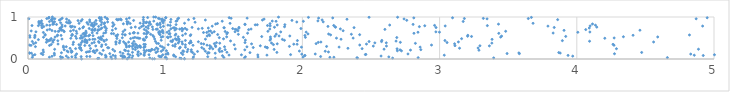
| Category | Series 0 |
|---|---|
| 0.3904208586501806 | 0.001 |
| 0.7224634683176403 | 0.002 |
| 93.24804790479168 | 0.003 |
| 1.0115581010432688 | 0.004 |
| 0.9070929696387279 | 0.005 |
| 0.9216799077854235 | 0.006 |
| 1.140309312723441 | 0.007 |
| 1.1406310190435358 | 0.008 |
| 0.6110892613390222 | 0.009 |
| 1.1173778949842978 | 0.01 |
| 9.550406828601867 | 0.011 |
| 0.507862508019153 | 0.012 |
| 10.350093718853833 | 0.013 |
| 0.24001847650218214 | 0.014 |
| 1.202125646748657 | 0.015 |
| 0.516437934840919 | 0.016 |
| 0.7275032811052431 | 0.017 |
| 0.6375950462996232 | 0.018 |
| 1.3656422560152768 | 0.019 |
| 1.1071588054082322 | 0.02 |
| 2.657551177952785 | 0.021 |
| 0.6905029887055065 | 0.022 |
| 0.7584504981340087 | 0.023 |
| 2.401090544615953 | 0.024 |
| 0.887607833776923 | 0.025 |
| 3.394194840833525 | 0.026 |
| 1.5779725088348266 | 0.027 |
| 2.3970208504834254 | 0.028 |
| 0.2935454160996004 | 0.029 |
| 6.54520538152202 | 0.03 |
| 2.8437195868729748 | 0.031 |
| 0.3474065861599035 | 0.032 |
| 4.660196273899444 | 0.033 |
| 1.0057952650747886 | 0.034 |
| 0.2521016348054121 | 0.035 |
| 1.4274591455377272 | 0.036 |
| 0.9996432079953819 | 0.037 |
| 0.03146978091118718 | 0.038 |
| 0.5669706977537479 | 0.039 |
| 2.200258844787325 | 0.04 |
| 0.7048157800695156 | 0.041 |
| 2.229505819442826 | 0.042 |
| 0.1559593540440948 | 0.043 |
| 0.73794206559285 | 0.044 |
| 2.0041774318019425 | 0.045 |
| 0.9693731355182663 | 0.046 |
| 1.6764291403293654 | 0.047 |
| 5.913428078234331 | 0.048 |
| 1.2061717591329149 | 0.049 |
| 2.629944489494246 | 0.05 |
| 0.6034730459098727 | 0.051 |
| 0.3196902168349919 | 0.052 |
| 1.5845676873782488 | 0.053 |
| 1.075687558202282 | 0.054 |
| 1.3101412361241942 | 0.055 |
| 0.23703898886081393 | 0.056 |
| 0.3873204045824351 | 0.057 |
| 0.9602662011952376 | 0.058 |
| 2.1329251492537775 | 0.059 |
| 0.45147952914074063 | 0.06 |
| 0.42835409408361447 | 0.061 |
| 0.7021967670487395 | 0.062 |
| 0.5693050346113226 | 0.063 |
| 0.17476697649603926 | 0.064 |
| 0.9717330086798003 | 0.065 |
| 56.40532943330702 | 0.066 |
| 0.6901861116166296 | 0.067 |
| 3.9702295942843358 | 0.068 |
| 0.27985299569156796 | 0.069 |
| 0.9535558575155026 | 0.07 |
| 2.5734029708976323 | 0.071 |
| 24.902312995444657 | 0.072 |
| 0.636637335461173 | 0.073 |
| 5.213605927915726 | 0.074 |
| 0.7628516542126448 | 0.075 |
| 15.06368990211785 | 0.076 |
| 1.0619913193970412 | 0.077 |
| 0.6780418851739588 | 0.078 |
| 1.4175017104825045 | 0.079 |
| 2.016623004243082 | 0.08 |
| 0.8043165984891493 | 0.081 |
| 0.34538997242948954 | 0.082 |
| 4.92156401695732 | 0.083 |
| 2.0186783364706637 | 0.084 |
| 0.0362806825921593 | 0.085 |
| 3.9362806010655884 | 0.086 |
| 0.8470096098435042 | 0.087 |
| 0.6198396741018343 | 0.088 |
| 0.5645281775505114 | 0.089 |
| 4.856336911274629 | 0.09 |
| 3.034061658264664 | 0.091 |
| 1.7415778233696646 | 0.092 |
| 11.74069348133084 | 0.093 |
| 1.4652456185568807 | 0.094 |
| 0.19261243383300874 | 0.095 |
| 1.0619821446761968 | 0.096 |
| 1.6750869750640809 | 0.097 |
| 0.741900072375269 | 0.098 |
| 1.5556235815098671 | 0.099 |
| 0.9826933407859471 | 0.1 |
| 5.0032971514174776 | 0.101 |
| 0.8823689682634753 | 0.102 |
| 0.05033637797966757 | 0.103 |
| 1.913903141764744 | 0.104 |
| 0.10856611668738951 | 0.105 |
| 2.458949905042348 | 0.106 |
| 0.8463501018340568 | 0.107 |
| 5.945781745367078 | 0.108 |
| 1.1283838234190875 | 0.109 |
| 2.4627177933071036 | 0.11 |
| 0.536779817446193 | 0.111 |
| 0.7989448526892731 | 0.112 |
| 1.212809771813365 | 0.113 |
| 1.005748639909137 | 0.114 |
| 1.9953955701724966 | 0.115 |
| 0.729148160365058 | 0.116 |
| 4.830407907290476 | 0.117 |
| 1.021093727402213 | 0.118 |
| 2.093510772456517 | 0.119 |
| 2.7695282704059436 | 0.12 |
| 0.3542711326076258 | 0.121 |
| 0.8210768299715608 | 0.122 |
| 17.97601704199181 | 0.123 |
| 158.7590128667085 | 0.124 |
| 4.274740190742463 | 0.125 |
| 5.912430309858572 | 0.126 |
| 3.581582078901271 | 0.127 |
| 0.5959013044789266 | 0.128 |
| 0.09705163452122967 | 0.129 |
| 3.491926829170612 | 0.13 |
| 23.156264711911263 | 0.131 |
| 7.968953658375679 | 0.132 |
| 0.6917674384013444 | 0.133 |
| 1.3085797286923673 | 0.134 |
| 5.324989735651629 | 0.135 |
| 0.1919611470316079 | 0.136 |
| 0.025143612356156034 | 0.137 |
| 1.364637392657013 | 0.138 |
| 0.01197382808617128 | 0.139 |
| 0.5231391948127904 | 0.14 |
| 3.8789555203863126 | 0.141 |
| 1.0182714674002338 | 0.142 |
| 0.010638228529836763 | 0.143 |
| 1.1181338290595644 | 0.144 |
| 3.5779136777138745 | 0.145 |
| 12.118537452557282 | 0.146 |
| 1.319633804926313 | 0.147 |
| 0.2434603915180901 | 0.148 |
| 0.8496520167695997 | 0.149 |
| 0.48779918920067505 | 0.15 |
| 1.3127603893806319 | 0.151 |
| 1.6177533933054504 | 0.152 |
| 3.8687753673519003 | 0.153 |
| 1.1997959088008232 | 0.154 |
| 0.9329654674737099 | 0.155 |
| 4.472819152503994 | 0.156 |
| 1.814087955553271 | 0.157 |
| 0.7614984726515731 | 0.158 |
| 0.3165766565693606 | 0.159 |
| 1.4500134866399834 | 0.16 |
| 0.42524663592827866 | 0.161 |
| 0.6720742327133846 | 0.162 |
| 7.023590245757066 | 0.163 |
| 5.859085602453996 | 0.164 |
| 0.11249944870154838 | 0.165 |
| 0.8523924857561492 | 0.166 |
| 0.8018323006045415 | 0.167 |
| 2.1897798361963168 | 0.168 |
| 0.29222430999851506 | 0.169 |
| 0.4819432856519468 | 0.17 |
| 0.8040731521794381 | 0.171 |
| 0.4376037572626588 | 0.172 |
| 5.52774229598955 | 0.173 |
| 1.1600246813176922 | 0.174 |
| 0.32118382544690827 | 0.175 |
| 1.3974455405173736 | 0.176 |
| 1.1904910924124774 | 0.177 |
| 1.134271802338638 | 0.178 |
| 0.44955240467382923 | 0.179 |
| 1.2358798282290104 | 0.18 |
| 0.9447957674853399 | 0.181 |
| 0.4738977761460838 | 0.182 |
| 1.4137301253187264 | 0.183 |
| 0.971265073639037 | 0.184 |
| 2.16631409319161 | 0.185 |
| 1.2926219802228434 | 0.186 |
| 0.7311537584401281 | 0.187 |
| 0.6318015515967654 | 0.188 |
| 1.978031969538785 | 0.189 |
| 0.8921212343450291 | 0.19 |
| 0.28492352538025917 | 0.191 |
| 8.03472377380157 | 0.192 |
| 117.96141894439498 | 0.193 |
| 2.7220411136727565 | 0.194 |
| 1.130028786211404 | 0.195 |
| 2.69222020570313 | 0.196 |
| 1.0088805800135765 | 0.197 |
| 0.4790731452161299 | 0.198 |
| 0.3155721265950204 | 0.199 |
| 0.7117137818727228 | 0.2 |
| 0.8834366943745738 | 0.201 |
| 0.8795194671797385 | 0.202 |
| 0.8646546344104761 | 0.203 |
| 5.321586537450074 | 0.204 |
| 0.4995399434966901 | 0.205 |
| 0.5480714485456839 | 0.206 |
| 0.846292543994284 | 0.207 |
| 0.38963819358408885 | 0.208 |
| 3.286884652759784 | 0.209 |
| 0.5031527630298526 | 0.21 |
| 79.73821878344116 | 0.211 |
| 2.787827099544835 | 0.212 |
| 0.7043659235199754 | 0.213 |
| 0.11048746995592763 | 0.214 |
| 0.9836523539448905 | 0.215 |
| 1.3918197187474795 | 0.216 |
| 1.5802657551381485 | 0.217 |
| 2.7117195548751556 | 0.218 |
| 1.1905959896139902 | 0.219 |
| 0.9221680847900617 | 0.22 |
| 0.26384874631213656 | 0.221 |
| 2.8632048914007164 | 0.222 |
| 1.4369054737756923 | 0.223 |
| 0.9035731197171718 | 0.224 |
| 0.7823927675280756 | 0.225 |
| 0.6181798721518252 | 0.226 |
| 1.1654880344272986 | 0.227 |
| 1.793939052606178 | 0.228 |
| 0.9014976633190611 | 0.229 |
| 6.047846491273578 | 0.23 |
| 0.19421974173355375 | 0.231 |
| 23.277162177307627 | 0.232 |
| 4.886752051951847 | 0.233 |
| 2.5951405063250155 | 0.234 |
| 19.170734804408024 | 0.235 |
| 25.277890034087584 | 0.236 |
| 8.41282374842962 | 0.237 |
| 1.2813851694060185 | 0.238 |
| 1.510515908911397 | 0.239 |
| 0.7641239980142636 | 0.24 |
| 0.9469437901512678 | 0.241 |
| 1.3469380910977513 | 0.242 |
| 2.6900101909553245 | 0.243 |
| 24.942244019144493 | 0.244 |
| 4.288977885256083 | 0.245 |
| 2.435209371449018 | 0.246 |
| 0.3470431873699796 | 0.247 |
| 7.355784567148473 | 0.248 |
| 1.3243503714505216 | 0.249 |
| 0.3778550004000554 | 0.25 |
| 1.3983599060514624 | 0.251 |
| 0.4554508042119398 | 0.252 |
| 8.024750004593155 | 0.253 |
| 0.30644777368299403 | 0.254 |
| 2.3319127307787237 | 0.255 |
| 1.1041253409286558 | 0.256 |
| 3.1454974894645527 | 0.257 |
| 14.6812923480931 | 0.258 |
| 0.38344208950222985 | 0.259 |
| 5.241976877969311 | 0.26 |
| 9.764916453418863 | 0.261 |
| 3.2806386266519714 | 0.262 |
| 0.9921925398643346 | 0.263 |
| 0.9355945908941822 | 0.264 |
| 1.744329357301709 | 0.265 |
| 15.801703717176938 | 0.266 |
| 0.5881181354861371 | 0.267 |
| 0.7975278827252588 | 0.268 |
| 0.3823315296322677 | 0.269 |
| 0.5803106599537039 | 0.27 |
| 1.266500687621383 | 0.271 |
| 0.3756621980712856 | 0.272 |
| 1.64161984780203 | 0.273 |
| 0.8439505078716326 | 0.274 |
| 0.25848305001874755 | 0.275 |
| 0.8198551878300591 | 0.276 |
| 7.735245040437717 | 0.277 |
| 1.7422060828999955 | 0.278 |
| 1.1097293144348754 | 0.279 |
| 0.781657130806268 | 0.28 |
| 1.1474498165344857 | 0.281 |
| 1.9931385735935652 | 0.282 |
| 2.858165330383202 | 0.283 |
| 2.267476089645902 | 0.284 |
| 1.3347944969167351 | 0.285 |
| 0.7178546332825597 | 0.286 |
| 1.7296599392468217 | 0.287 |
| 0.9790882009847365 | 0.288 |
| 0.8528109273962623 | 0.289 |
| 1.5956466996195382 | 0.29 |
| 1.4324795348564159 | 0.291 |
| 0.27891887790711245 | 0.292 |
| 0.8488847681106056 | 0.293 |
| 0.05426887653352738 | 0.294 |
| 1.3678082073680136 | 0.295 |
| 0.737411304130869 | 0.296 |
| 0.7589263679845272 | 0.297 |
| 0.5352886536274918 | 0.298 |
| 2.176270093264477 | 0.299 |
| 1.9052629820552063 | 0.3 |
| 1.071361686140702 | 0.301 |
| 58.21699415183581 | 0.302 |
| 0.8190259761217356 | 0.303 |
| 0.8124092553414924 | 0.304 |
| 0.25809805886529313 | 0.305 |
| 31.448216722459293 | 0.306 |
| 2.5167705738864847 | 0.307 |
| 2.612545223973778 | 0.308 |
| 0.9650133964150819 | 0.309 |
| 0.7392258499579542 | 0.31 |
| 0.49388621267291066 | 0.311 |
| 3.3628493724110458 | 0.312 |
| 0.8141473438941318 | 0.313 |
| 1.6932961368511223 | 0.314 |
| 3.2940278840485244 | 0.315 |
| 1.3666161976212794 | 0.316 |
| 3.112141792572463 | 0.317 |
| 1.3248718606952778 | 0.318 |
| 1.0559086602199563 | 0.319 |
| 0.44803328018792715 | 0.32 |
| 0.793693028592533 | 0.321 |
| 0.4140926467568455 | 0.322 |
| 0.1568560706517375 | 0.323 |
| 0.021667784241185074 | 0.324 |
| 5.65688191719371 | 0.325 |
| 1.202817243424866 | 0.326 |
| 4.271144927182041 | 0.327 |
| 0.7684586897208964 | 0.328 |
| 0.7161234195522486 | 0.329 |
| 1.304858307674221 | 0.33 |
| 0.011200334743358284 | 0.331 |
| 2.941055127369758 | 0.332 |
| 2.4180382251008137 | 0.333 |
| 7.389168097169208 | 0.334 |
| 8.782734696534185 | 0.335 |
| 0.5383787424957595 | 0.336 |
| 0.3828867252114427 | 0.337 |
| 1.5029693317823798 | 0.338 |
| 1.147139161308411 | 0.339 |
| 1.0217572150020646 | 0.34 |
| 26.637621752016454 | 0.341 |
| 0.37132071262303584 | 0.342 |
| 1.7888178692920575 | 0.343 |
| 0.5675744616093484 | 0.344 |
| 0.16915017847176536 | 0.345 |
| 0.8555383870601507 | 0.346 |
| 0.32823431526187147 | 0.347 |
| 5.3008725324470785 | 0.348 |
| 0.844542605896369 | 0.349 |
| 4.264071060744708 | 0.35 |
| 1.9614668201970984 | 0.351 |
| 1.0746633946236614 | 0.352 |
| 1.9370705574869416 | 0.353 |
| 0.6411286310465669 | 0.354 |
| 2.4669628815766083 | 0.355 |
| 0.21896560519905092 | 0.356 |
| 0.7828909964774883 | 0.357 |
| 1.2804179768354724 | 0.358 |
| 1.1257984665232028 | 0.359 |
| 1.6294331305511143 | 0.36 |
| 1.8165185662102985 | 0.361 |
| 3.1094192211225464 | 0.362 |
| 0.7135026869649641 | 0.363 |
| 0.04069675924937377 | 0.364 |
| 1.3581173492064302 | 0.365 |
| 2.0999471747960095 | 0.366 |
| 1.262586170554558 | 0.367 |
| 0.9507399265441291 | 0.368 |
| 6.367951670640007 | 0.369 |
| 0.7614148194771593 | 0.37 |
| 0.7080286173931498 | 0.371 |
| 6.805960710954278 | 0.372 |
| 2.823622429249192 | 0.373 |
| 0.9379006862825919 | 0.374 |
| 6.769969397307347 | 0.375 |
| 0.46606503327524906 | 0.376 |
| 1.3975804267537821 | 0.377 |
| 3.3809670414581094 | 0.378 |
| 1.1771537448248792 | 0.379 |
| 1.7749252857895015 | 0.38 |
| 1.1789684430766096 | 0.381 |
| 1.0954842723782914 | 0.382 |
| 0.6666815312890992 | 0.383 |
| 2.5281008697332554 | 0.384 |
| 2.6114349741576786 | 0.385 |
| 9.950072016151392 | 0.386 |
| 0.05619769856632537 | 0.387 |
| 0.4294095921813461 | 0.388 |
| 1.3735627660368062 | 0.389 |
| 0.3889910412966396 | 0.39 |
| 1.5817452535383172 | 0.391 |
| 3.054370265272698 | 0.392 |
| 0.5187153518624924 | 0.393 |
| 1.1892641643772104 | 0.394 |
| 0.48271697695913324 | 0.395 |
| 2.1157017495997854 | 0.396 |
| 2.7139338688091463 | 0.397 |
| 0.13396020345995077 | 0.398 |
| 0.1814616534107095 | 0.399 |
| 0.33130002297210914 | 0.4 |
| 0.6408810071944332 | 0.401 |
| 0.7333349617704902 | 0.402 |
| 0.4181856590861211 | 0.403 |
| 2.1349069343515126 | 0.404 |
| 4.559809181897219 | 0.405 |
| 3.137043105622319 | 0.406 |
| 0.4124993860407378 | 0.407 |
| 1.1227438056980559 | 0.408 |
| 0.641122539675348 | 0.409 |
| 0.6969200517213295 | 0.41 |
| 1.2417511584264074 | 0.411 |
| 6.262392033236318 | 0.412 |
| 1.051038641856876 | 0.413 |
| 2.576656647310373 | 0.414 |
| 0.5141192893243821 | 0.415 |
| 2.4861829075815076 | 0.416 |
| 0.03146321880194156 | 0.417 |
| 0.7720410800046276 | 0.418 |
| 0.9288959199092058 | 0.419 |
| 1.1017804738062131 | 0.42 |
| 21.034438249662692 | 0.421 |
| 0.5555179773554528 | 0.422 |
| 4.093135679291383 | 0.423 |
| 0.428693383228482 | 0.424 |
| 1.0411705567535947 | 0.425 |
| 2.682665428400688 | 0.426 |
| 1.1857168087870182 | 0.427 |
| 11.093064698798587 | 0.428 |
| 0.3966056542464333 | 0.429 |
| 1.4763385132316118 | 0.43 |
| 0.18017049488987097 | 0.431 |
| 0.1500572731455885 | 0.432 |
| 0.6694599687070822 | 0.433 |
| 0.21747738940950445 | 0.434 |
| 19.735894233891603 | 0.435 |
| 0.4306758068743165 | 0.436 |
| 3.8948436372382074 | 0.437 |
| 0.14340086661366652 | 0.438 |
| 1.9635532698305795 | 0.439 |
| 3.0389454064260435 | 0.44 |
| 1.1471496341994645 | 0.441 |
| 0.5520845891743339 | 0.442 |
| 2.579019303413462 | 0.443 |
| 5.716257014218051 | 0.444 |
| 1.8691235557517665 | 0.445 |
| 0.9708793183225154 | 0.446 |
| 1.7637536535128082 | 0.447 |
| 0.8502823246144781 | 0.448 |
| 0.16218598872092177 | 0.449 |
| 1.5844644654871218 | 0.45 |
| 0.15793613932950856 | 0.451 |
| 1.0557551022268263 | 0.452 |
| 5.293856799928572 | 0.453 |
| 0.8424322247942896 | 0.454 |
| 0.41855751092524496 | 0.455 |
| 0.5720801074917394 | 0.456 |
| 1.0840229069558325 | 0.457 |
| 0.1897687842028945 | 0.458 |
| 10.653794305220957 | 0.459 |
| 0.41618772630650974 | 0.46 |
| 0.07584135809394718 | 0.461 |
| 0.13562664237075991 | 0.462 |
| 0.44865261951185365 | 0.463 |
| 0.5342527095661235 | 0.464 |
| 1.1016926527154316 | 0.465 |
| 1.0819251183529424 | 0.466 |
| 1.8542778152276798 | 0.467 |
| 3.382403449417808 | 0.468 |
| 0.48734814495501083 | 0.469 |
| 0.47273842640076386 | 0.47 |
| 2.2815518987534853 | 0.471 |
| 1.2932584743116102 | 0.472 |
| 13.938231792238213 | 0.473 |
| 0.8417622377425202 | 0.474 |
| 0.2477292188242144 | 0.475 |
| 0.9230808357580139 | 0.476 |
| 9.310833234141361 | 0.477 |
| 1.7686426520817538 | 0.478 |
| 5.776873031833621 | 0.479 |
| 1.4251229310205578 | 0.48 |
| 0.5252282885662322 | 0.481 |
| 1.0978005429573467 | 0.482 |
| 1.073571669352955 | 0.483 |
| 3.1603683917097745 | 0.484 |
| 0.5353080606821404 | 0.485 |
| 0.7480526482233805 | 0.486 |
| 0.16909036491608972 | 0.487 |
| 0.6479701050859636 | 0.488 |
| 6.121611183742235 | 0.489 |
| 9.59061035482723 | 0.49 |
| 0.3531861213231779 | 0.491 |
| 0.8153262110036582 | 0.492 |
| 0.3121419127985828 | 0.493 |
| 4.204225142029085 | 0.494 |
| 0.3803105137877545 | 0.495 |
| 0.8048035969210765 | 0.496 |
| 2.248398952043917 | 0.497 |
| 2.3699087667680745 | 0.498 |
| 0.3913678725219491 | 0.499 |
| 12.89361255985204 | 0.5 |
| 4.272302785188142 | 0.501 |
| 0.7660944696891553 | 0.502 |
| 6.87664539235033 | 0.503 |
| 0.7948689469002811 | 0.504 |
| 0.6875089786678268 | 0.505 |
| 0.5136376542440113 | 0.506 |
| 1.021677011976477 | 0.507 |
| 1.3942765584423715 | 0.508 |
| 0.3979397671254565 | 0.509 |
| 0.04871121249158478 | 0.51 |
| 2.6880501011494107 | 0.511 |
| 6.323269155851756 | 0.512 |
| 0.861049278189524 | 0.513 |
| 0.779125453457478 | 0.514 |
| 2.021960303166296 | 0.515 |
| 1.5698477296740994 | 0.516 |
| 0.014002758030806155 | 0.517 |
| 0.11302047677649103 | 0.518 |
| 0.9708336569971437 | 0.519 |
| 0.5291953637817998 | 0.52 |
| 1.0163143855008285 | 0.521 |
| 3.4449906410928333 | 0.522 |
| 0.19738347091202565 | 0.523 |
| 1.766783949189999 | 0.524 |
| 4.589734910363589 | 0.525 |
| 0.9171983754308478 | 0.526 |
| 1.4481159805186752 | 0.527 |
| 0.862900761577306 | 0.528 |
| 1.0947204718675219 | 0.529 |
| 4.339636828232408 | 0.53 |
| 1.0387327979210894 | 0.531 |
| 17.155339138235135 | 0.532 |
| 0.9827301171949628 | 0.533 |
| 1.7035140276119467 | 0.534 |
| 0.6471458408211673 | 0.535 |
| 6.437053850442917 | 0.536 |
| 3.2328956688817865 | 0.537 |
| 3.9193174714235903 | 0.538 |
| 9.431743792715974 | 0.539 |
| 0.34682815102568915 | 0.54 |
| 1.7995279773646176 | 0.541 |
| 3.204266936956279 | 0.542 |
| 0.4117449871243038 | 0.543 |
| 0.050251544060419054 | 0.544 |
| 3.4519087179473296 | 0.545 |
| 0.5456855817254778 | 0.546 |
| 1.3058170119630044 | 0.547 |
| 1.908382896510368 | 0.548 |
| 1.829888600376147 | 0.549 |
| 0.4413069965760895 | 0.55 |
| 0.421352724153748 | 0.551 |
| 0.21363533029562165 | 0.552 |
| 0.6411877274969998 | 0.553 |
| 0.3876433497952382 | 0.554 |
| 0.4742293177359107 | 0.555 |
| 0.013229425775801195 | 0.556 |
| 1.183010713885341 | 0.557 |
| 1.323849540716825 | 0.558 |
| 0.9098615149983513 | 0.559 |
| 2.0183660820913123 | 0.56 |
| 0.31833893025624643 | 0.561 |
| 0.2408705279670828 | 0.562 |
| 1.1268008603030633 | 0.563 |
| 3.205734331354204 | 0.564 |
| 4.410147673979388 | 0.565 |
| 0.05041749623190172 | 0.566 |
| 1.0724903690537895 | 0.567 |
| 0.12491619584036501 | 0.568 |
| 0.4496378801231402 | 0.569 |
| 0.21555274746224648 | 0.57 |
| 0.32308555401752 | 0.571 |
| 4.821161566057795 | 0.572 |
| 0.7055026647868929 | 0.573 |
| 2.205497184713306 | 0.574 |
| 0.709068447875367 | 0.575 |
| 0.9624176337359006 | 0.576 |
| 1.1866263044508318 | 0.577 |
| 0.6535087920631155 | 0.578 |
| 2.417376444770861 | 0.579 |
| 1.319693168478628 | 0.58 |
| 0.41646949520481014 | 0.581 |
| 1.382463995696308 | 0.582 |
| 0.1250221662884606 | 0.583 |
| 19.888950601966595 | 0.584 |
| 6.939876856430576 | 0.585 |
| 0.32244020358749304 | 0.586 |
| 1.5331938596092531 | 0.587 |
| 0.6883997601302453 | 0.588 |
| 2.3569047135962946 | 0.589 |
| 0.8935345078750563 | 0.59 |
| 1.8094723713102372 | 0.591 |
| 6.7468289982195255 | 0.592 |
| 1.0778839968203362 | 0.593 |
| 1.0290430652743383 | 0.594 |
| 2.191087699310631 | 0.595 |
| 0.8635234798668812 | 0.596 |
| 2.0408113858049006 | 0.597 |
| 1.4488867474670468 | 0.598 |
| 0.4140076038801558 | 0.599 |
| 1.147878838348473 | 0.6 |
| 0.40158542243020046 | 0.601 |
| 0.9557391533688684 | 0.602 |
| 0.6239583766237099 | 0.603 |
| 0.7418491447320835 | 0.604 |
| 0.6084631287980052 | 0.605 |
| 1.0339834499096854 | 0.606 |
| 0.8460632784986882 | 0.607 |
| 23.81535852002579 | 0.608 |
| 8.130427622399951 | 0.609 |
| 0.35542936237883704 | 0.61 |
| 3.431552031871379 | 0.611 |
| 2.813072646745914 | 0.612 |
| 0.4095456674859443 | 0.613 |
| 1.6006179160871576 | 0.614 |
| 0.5522367538156489 | 0.615 |
| 0.8014237295085975 | 0.616 |
| 0.503442824909203 | 0.617 |
| 3.8275607190989898 | 0.618 |
| 0.9848679755064541 | 0.619 |
| 0.4244611934430632 | 0.62 |
| 0.7677268907027331 | 0.621 |
| 1.3416193295574412 | 0.622 |
| 0.46837706652147176 | 0.623 |
| 24.842036890783135 | 0.624 |
| 0.7748425223311115 | 0.625 |
| 1.4540890629265417 | 0.626 |
| 0.7712045186550566 | 0.627 |
| 0.5661879894500172 | 0.628 |
| 0.8684520917351339 | 0.629 |
| 1.279267699236724 | 0.63 |
| 1.3029033240728747 | 0.631 |
| 0.11217019475596157 | 0.632 |
| 5.390132872381211 | 0.633 |
| 0.8762209405041707 | 0.634 |
| 1.0140224074949704 | 0.635 |
| 4.007638871147566 | 0.636 |
| 2.8423798246051613 | 0.637 |
| 0.9524384403966566 | 0.638 |
| 2.9990110544887334 | 0.639 |
| 2.0275254849075015 | 0.64 |
| 5.654907615969528 | 0.641 |
| 0.9675966149297412 | 0.642 |
| 4.095305277713892 | 0.643 |
| 6.8493707498950265 | 0.644 |
| 1.8421208580128212 | 0.645 |
| 2.9729240434023008 | 0.646 |
| 0.05790716581582192 | 0.647 |
| 1.5092280033868015 | 0.648 |
| 16.37787217884195 | 0.649 |
| 1.3573650302006008 | 0.65 |
| 0.26384268594952004 | 0.651 |
| 6.520109036075198 | 0.652 |
| 0.6934857405888639 | 0.653 |
| 0.9823340658957682 | 0.654 |
| 1.4373581398158493 | 0.655 |
| 0.9580798368200591 | 0.656 |
| 0.22065383300935362 | 0.657 |
| 0.19789085282626181 | 0.658 |
| 1.748571756921061 | 0.659 |
| 3.481518944652295 | 0.66 |
| 1.317992830750488 | 0.661 |
| 0.35214019507795863 | 0.662 |
| 0.42230626469177274 | 0.663 |
| 6.88821135185616 | 0.664 |
| 0.3103911331907326 | 0.665 |
| 0.22665990290311516 | 0.666 |
| 1.3300182262621225 | 0.667 |
| 0.02331861185967197 | 0.668 |
| 1.1234443391538809 | 0.669 |
| 1.028880496640483 | 0.67 |
| 1.530474699156374 | 0.671 |
| 0.25916347855301436 | 0.672 |
| 2.2968306498893467 | 0.673 |
| 5.220891816286449 | 0.674 |
| 0.8623661527546982 | 0.675 |
| 16.485124475765094 | 0.676 |
| 0.5676158769812841 | 0.677 |
| 0.17446631250929173 | 0.678 |
| 0.4711724446822549 | 0.679 |
| 0.5100732750481036 | 0.68 |
| 6.413748794843079 | 0.681 |
| 3.9069843890500118 | 0.682 |
| 0.4866747537477987 | 0.683 |
| 0.9796060438249451 | 0.684 |
| 4.460246032655377 | 0.685 |
| 0.6149849693295556 | 0.686 |
| 0.3312109244611239 | 0.687 |
| 0.24452868088310695 | 0.688 |
| 1.0707562504072246 | 0.689 |
| 0.13985655317319276 | 0.69 |
| 0.46378077475159063 | 0.691 |
| 0.7065009865070987 | 0.692 |
| 0.5093411573632229 | 0.693 |
| 0.2439212913147134 | 0.694 |
| 6.736821997649844 | 0.695 |
| 9.006278264315249 | 0.696 |
| 0.5172877811782165 | 0.697 |
| 1.5218718401081295 | 0.698 |
| 1.608100132511342 | 0.699 |
| 4.065334467691892 | 0.7 |
| 1.1579228749945865 | 0.701 |
| 0.4699691008227611 | 0.702 |
| 0.8476960734756221 | 0.703 |
| 0.9103735672586916 | 0.704 |
| 2.601429635325922 | 0.705 |
| 1.5101179123244661 | 0.706 |
| 80.13050870879037 | 0.707 |
| 0.15793208123654884 | 0.708 |
| 0.9346796611308511 | 0.709 |
| 1.1296081117325278 | 0.71 |
| 0.9428303539640747 | 0.711 |
| 1.105543295409323 | 0.712 |
| 1.7623295215708759 | 0.713 |
| 1.6259418471592257 | 0.714 |
| 0.4880138142161577 | 0.715 |
| 0.5304129881128054 | 0.716 |
| 2.2767005664439526 | 0.717 |
| 1.2418008524443027 | 0.718 |
| 1.081482371712339 | 0.719 |
| 0.3753790391804685 | 0.72 |
| 1.0418288506191744 | 0.721 |
| 0.6390629006728678 | 0.722 |
| 0.23226775256261248 | 0.723 |
| 1.4922930704161015 | 0.724 |
| 1.9891346157443373 | 0.725 |
| 0.5713377336911187 | 0.726 |
| 0.4462993760892435 | 0.727 |
| 1.1214190525784324 | 0.728 |
| 1.1450945894957527 | 0.729 |
| 1.2699824523779029 | 0.73 |
| 0.8756175483167488 | 0.731 |
| 1.5370030529889407 | 0.732 |
| 7.684845185725844 | 0.733 |
| 0.23853479807791603 | 0.734 |
| 21.967297309785888 | 0.735 |
| 0.8121263985871339 | 0.736 |
| 1.314203894944333 | 0.737 |
| 4.091095872769901 | 0.738 |
| 0.5385993058498298 | 0.739 |
| 0.23509623824965348 | 0.74 |
| 1.42962518079982 | 0.741 |
| 1.0585294974109034 | 0.742 |
| 1.0695271000139766 | 0.743 |
| 0.3997498026417548 | 0.744 |
| 0.1024692833687726 | 0.745 |
| 1.4287107034080755 | 0.746 |
| 2.3763691754010035 | 0.747 |
| 0.7519621099807374 | 0.748 |
| 2.973960524850874 | 0.749 |
| 21.07771273837173 | 0.75 |
| 3.835410028873843 | 0.751 |
| 1.1959474845280478 | 0.752 |
| 1.5377525487067583 | 0.753 |
| 6.13103276328455 | 0.754 |
| 0.9662372109909063 | 0.755 |
| 1.796446970112907 | 0.756 |
| 2.2417701120070457 | 0.757 |
| 0.3142179397726614 | 0.758 |
| 4.145721763557049 | 0.759 |
| 0.860129627791915 | 0.76 |
| 0.5587654559270461 | 0.761 |
| 0.7822565191787763 | 0.762 |
| 0.3410542033077064 | 0.763 |
| 0.9066918015237666 | 0.764 |
| 2.238199223395075 | 0.765 |
| 0.24820882192164212 | 0.766 |
| 0.4048788818803183 | 0.767 |
| 1.8698744929104663 | 0.768 |
| 9.589265142214416 | 0.769 |
| 2.852636321118615 | 0.77 |
| 0.8274485933489879 | 0.771 |
| 0.11481442867574006 | 0.772 |
| 0.4756108501479671 | 0.773 |
| 0.5614237170311664 | 0.774 |
| 0.5150119574291028 | 0.775 |
| 2.186288701019539 | 0.776 |
| 0.32433199595293216 | 0.777 |
| 0.9871366344636071 | 0.778 |
| 0.6175805546115618 | 0.779 |
| 0.31025978776985386 | 0.78 |
| 1.3427108473633473 | 0.781 |
| 11.053441451966998 | 0.782 |
| 3.7897225646563246 | 0.783 |
| 4.917107626604099 | 0.784 |
| 0.47556436135963365 | 0.785 |
| 0.27090897940593683 | 0.786 |
| 3.0407518577077126 | 0.787 |
| 4.097196721461319 | 0.788 |
| 1.7652365128783878 | 0.789 |
| 0.8777757371290655 | 0.79 |
| 2.8920060699390002 | 0.791 |
| 0.840876225842466 | 0.792 |
| 0.0989026941971464 | 0.793 |
| 0.0756739704512041 | 0.794 |
| 3.3480425600874963 | 0.795 |
| 0.029209839617404944 | 0.796 |
| 1.7457459859455589 | 0.797 |
| 2.2284564663585584 | 0.798 |
| 1.0366121972623792 | 0.799 |
| 2.9633947652450003 | 0.8 |
| 6.13341769971084 | 0.801 |
| 8.110746681986416 | 0.802 |
| 0.460339931855753 | 0.803 |
| 0.1586429587506959 | 0.804 |
| 4.135934265599242 | 0.805 |
| 1.019880192066307 | 0.806 |
| 0.13717265792512418 | 0.807 |
| 2.636283963436471 | 0.808 |
| 0.4845718425661668 | 0.809 |
| 1.8164547382943732 | 0.81 |
| 0.2482502223654618 | 0.811 |
| 0.944484681728183 | 0.812 |
| 1.6561101741647337 | 0.813 |
| 0.4691568755874354 | 0.814 |
| 1.6709216538141514 | 0.815 |
| 0.5331067747112128 | 0.816 |
| 1.8722371451791149 | 0.817 |
| 0.6269096842983549 | 0.818 |
| 1.0793597712752814 | 0.819 |
| 0.9628300460011773 | 0.82 |
| 1.5821109798146624 | 0.821 |
| 0.20809023222248885 | 0.822 |
| 28.34464438005356 | 0.823 |
| 2.806786532623662 | 0.824 |
| 0.8942030511264604 | 0.825 |
| 0.9402363284490792 | 0.826 |
| 0.4383343158990932 | 0.827 |
| 0.1800505286922633 | 0.828 |
| 1.5812138314662936 | 0.829 |
| 3.4292362008714457 | 0.83 |
| 0.18689783513779618 | 0.831 |
| 1.3677345109928727 | 0.832 |
| 0.7234336199262603 | 0.833 |
| 4.114373692976871 | 0.834 |
| 0.1044831796449515 | 0.835 |
| 0.49836636878115165 | 0.836 |
| 7.235447278940649 | 0.837 |
| 0.695118767330526 | 0.838 |
| 0.5555955953841669 | 0.839 |
| 0.9422444530576715 | 0.84 |
| 0.08158119808744309 | 0.841 |
| 1.7642758751816896 | 0.842 |
| 0.8404590280656444 | 0.843 |
| 0.7447217726821034 | 0.844 |
| 1.3809665871349732 | 0.845 |
| 7.081350605145421 | 0.846 |
| 0.4663794362812266 | 0.847 |
| 0.3719465270996356 | 0.848 |
| 1.472779070224546 | 0.849 |
| 3.681216316731262 | 0.85 |
| 1.1410612207854511 | 0.851 |
| 0.7242192247950006 | 0.852 |
| 0.08908332190465151 | 0.853 |
| 0.817269568714948 | 0.854 |
| 21.132164312736265 | 0.855 |
| 0.9627441048433212 | 0.856 |
| 0.3019084785208391 | 0.857 |
| 0.8821811235123604 | 0.858 |
| 0.29227571146361475 | 0.859 |
| 0.9854243643111503 | 0.86 |
| 0.5590225115114484 | 0.861 |
| 0.6178545668263822 | 0.862 |
| 0.2378258726551669 | 0.863 |
| 0.8604093565942224 | 0.864 |
| 5.121853065425255 | 0.865 |
| 0.18430176698744863 | 0.866 |
| 0.4298477061588813 | 0.867 |
| 0.48382441007634003 | 0.868 |
| 14.42930962172575 | 0.869 |
| 0.538065284761738 | 0.87 |
| 0.0798733841105179 | 0.871 |
| 0.3087144056634487 | 0.872 |
| 0.094252777485118 | 0.873 |
| 63.871969511594955 | 0.874 |
| 1.2178176086857906 | 0.875 |
| 0.2808953615885153 | 0.876 |
| 0.8648655217477016 | 0.877 |
| 1.03862413239355 | 0.878 |
| 7.898277809410686 | 0.879 |
| 0.7306013768752986 | 0.88 |
| 1.959295194813699 | 0.881 |
| 0.5804510252645678 | 0.882 |
| 0.8874064666194521 | 0.883 |
| 2.1515420157031504 | 0.884 |
| 0.4502578594973019 | 0.885 |
| 17.19362817203372 | 0.886 |
| 0.19388148226648497 | 0.887 |
| 0.844029374711542 | 0.888 |
| 26.314175207726823 | 0.889 |
| 23.984858743028067 | 0.89 |
| 0.7208028398018299 | 0.891 |
| 0.15621605169462308 | 0.892 |
| 0.07964240872332826 | 0.893 |
| 3.1719570313002783 | 0.894 |
| 0.9793675479234069 | 0.895 |
| 5.5404775053961135 | 0.896 |
| 2.007141495749812 | 0.897 |
| 1.8081605452962881 | 0.898 |
| 1.0792147351257844 | 0.899 |
| 1.4155127808486827 | 0.9 |
| 0.3860175525299776 | 0.901 |
| 0.9168351758398506 | 0.902 |
| 1.7803494074970714 | 0.903 |
| 0.17728622897761107 | 0.904 |
| 6.253439999391572 | 0.905 |
| 0.9833192248468051 | 0.906 |
| 2.112955368582811 | 0.907 |
| 6.324252288898034 | 0.908 |
| 0.09865788437067759 | 0.909 |
| 1.085891226271179 | 0.91 |
| 16.49981266905924 | 0.911 |
| 7.172228114001234 | 0.912 |
| 0.5260195486323535 | 0.913 |
| 0.3646661407535191 | 0.914 |
| 0.298440026713346 | 0.915 |
| 0.4957026212468279 | 0.916 |
| 5.826415793014855 | 0.917 |
| 0.76967083688666 | 0.918 |
| 1.924077298256335 | 0.919 |
| 0.993262547169385 | 0.92 |
| 2.7606152167609928 | 0.921 |
| 5.298996344075952 | 0.922 |
| 6.390034344970811 | 0.923 |
| 115.65145936342161 | 0.924 |
| 0.9822397359753982 | 0.925 |
| 0.22916196421569773 | 0.926 |
| 1.7088449288551855 | 0.927 |
| 1.2927436580748741 | 0.928 |
| 0.44940656046890026 | 0.929 |
| 0.6541090573938296 | 0.93 |
| 2.1436364382000335 | 0.931 |
| 0.6799745876674193 | 0.932 |
| 0.9742773104695919 | 0.933 |
| 0.1711250017565807 | 0.934 |
| 0.840568103407627 | 0.935 |
| 1.1699184800159568 | 0.936 |
| 3.860548976741156 | 0.937 |
| 0.39493861138668324 | 0.938 |
| 0.6619744168909685 | 0.939 |
| 0.17065562711911017 | 0.94 |
| 5.347363525032748 | 0.941 |
| 1.0417063624853204 | 0.942 |
| 0.6459739960264405 | 0.943 |
| 0.5366232388212651 | 0.944 |
| 0.23933449873998433 | 0.945 |
| 2.3248812537555046 | 0.946 |
| 0.5791096890480143 | 0.947 |
| 6.064320983243577 | 0.948 |
| 0.6743743541550735 | 0.949 |
| 1.7207052520867903 | 0.95 |
| 0.2812430389798741 | 0.951 |
| 0.9784018997313967 | 0.952 |
| 0.7181107277564587 | 0.953 |
| 2.7407840673540367 | 0.954 |
| 1.0910542392763452 | 0.955 |
| 3.345867725561705 | 0.956 |
| 4.870004461492328 | 0.957 |
| 0.006153830790755532 | 0.958 |
| 0.19539539994281868 | 0.959 |
| 0.9589580208273971 | 0.96 |
| 0.18215116152090297 | 0.961 |
| 0.13699154811080433 | 0.962 |
| 3.6465885900874535 | 0.963 |
| 3.180481123510141 | 0.964 |
| 1.2092660904871828 | 0.965 |
| 0.5756357879976701 | 0.966 |
| 3.3187344768451634 | 0.967 |
| 0.9503710844115599 | 0.968 |
| 0.5211776687620281 | 0.969 |
| 1.4805012049400355 | 0.97 |
| 1.0979153789365275 | 0.971 |
| 0.24949854090349402 | 0.972 |
| 1.597159049301206 | 0.973 |
| 2.118099227154551 | 0.974 |
| 62.74953643919738 | 0.975 |
| 0.1502489836563948 | 0.976 |
| 0.7380492741270911 | 0.977 |
| 2.2210244998738515 | 0.978 |
| 2.812053821258277 | 0.979 |
| 1.0043942465165099 | 0.98 |
| 3.094410214134941 | 0.981 |
| 4.95030897444481 | 0.982 |
| 10.632358094712899 | 0.983 |
| 1.4664846668841447 | 0.984 |
| 0.5333561852938982 | 0.985 |
| 1.0041290298112941 | 0.986 |
| 0.8721517499110429 | 0.987 |
| 0.5205473819029942 | 0.988 |
| 0.8412110308525634 | 0.989 |
| 3.6690174108465534 | 0.99 |
| 2.044190808506821 | 0.991 |
| 0.15346263630930249 | 0.992 |
| 2.4860148067299415 | 0.993 |
| 2.693920149891621 | 0.994 |
| 0.5618831195921725 | 0.995 |
| 5.847813264353641 | 0.996 |
| 1.825914733379489 | 0.997 |
| 0.9304713082377991 | 0.998 |
| 0.9162643399369543 | 0.999 |
| 0.1776309915275302 | 1 |